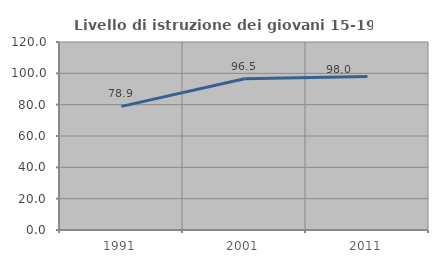
| Category | Livello di istruzione dei giovani 15-19 anni |
|---|---|
| 1991.0 | 78.92 |
| 2001.0 | 96.516 |
| 2011.0 | 98.031 |